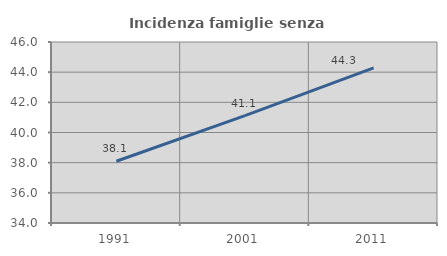
| Category | Incidenza famiglie senza nuclei |
|---|---|
| 1991.0 | 38.095 |
| 2001.0 | 41.113 |
| 2011.0 | 44.28 |